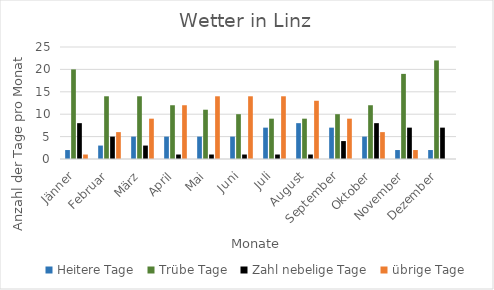
| Category | Heitere | Trübe | Zahl nebelige | übrige |
|---|---|---|---|---|
| Jänner | 2 | 20 | 8 | 1 |
| Februar | 3 | 14 | 5 | 6 |
| März | 5 | 14 | 3 | 9 |
| April | 5 | 12 | 1 | 12 |
| Mai | 5 | 11 | 1 | 14 |
| Juni | 5 | 10 | 1 | 14 |
| Juli | 7 | 9 | 1 | 14 |
| August | 8 | 9 | 1 | 13 |
| September | 7 | 10 | 4 | 9 |
| Oktober | 5 | 12 | 8 | 6 |
| November | 2 | 19 | 7 | 2 |
| Dezember | 2 | 22 | 7 | 0 |